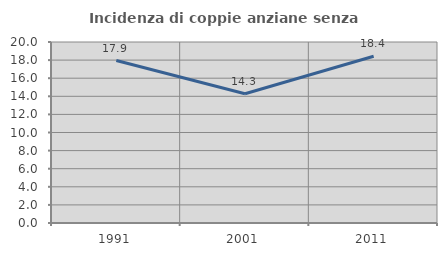
| Category | Incidenza di coppie anziane senza figli  |
|---|---|
| 1991.0 | 17.949 |
| 2001.0 | 14.286 |
| 2011.0 | 18.421 |